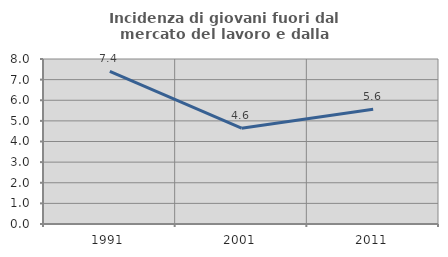
| Category | Incidenza di giovani fuori dal mercato del lavoro e dalla formazione  |
|---|---|
| 1991.0 | 7.402 |
| 2001.0 | 4.643 |
| 2011.0 | 5.567 |